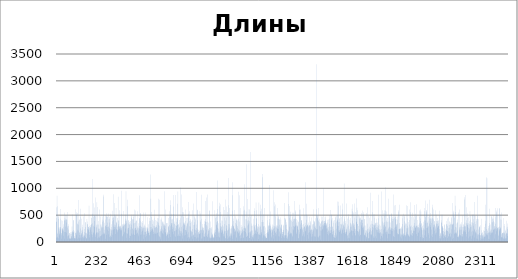
| Category | Series 0 |
|---|---|
| 0 | 445 |
| 1 | 380 |
| 2 | 83 |
| 3 | 373 |
| 4 | 645 |
| 5 | 859 |
| 6 | 99 |
| 7 | 174 |
| 8 | 79 |
| 9 | 666 |
| 10 | 151 |
| 11 | 461 |
| 12 | 430 |
| 13 | 271 |
| 14 | 71 |
| 15 | 486 |
| 16 | 248 |
| 17 | 273 |
| 18 | 211 |
| 19 | 127 |
| 20 | 151 |
| 21 | 172 |
| 22 | 236 |
| 23 | 614 |
| 24 | 433 |
| 25 | 279 |
| 26 | 270 |
| 27 | 407 |
| 28 | 169 |
| 29 | 60 |
| 30 | 159 |
| 31 | 126 |
| 32 | 249 |
| 33 | 216 |
| 34 | 262 |
| 35 | 247 |
| 36 | 397 |
| 37 | 233 |
| 38 | 235 |
| 39 | 286 |
| 40 | 199 |
| 41 | 117 |
| 42 | 330 |
| 43 | 396 |
| 44 | 186 |
| 45 | 61 |
| 46 | 547 |
| 47 | 409 |
| 48 | 453 |
| 49 | 407 |
| 50 | 432 |
| 51 | 288 |
| 52 | 504 |
| 53 | 186 |
| 54 | 424 |
| 55 | 414 |
| 56 | 174 |
| 57 | 364 |
| 58 | 502 |
| 59 | 415 |
| 60 | 263 |
| 61 | 295 |
| 62 | 557 |
| 63 | 62 |
| 64 | 106 |
| 65 | 300 |
| 66 | 329 |
| 67 | 125 |
| 68 | 233 |
| 69 | 117 |
| 70 | 139 |
| 71 | 72 |
| 72 | 169 |
| 73 | 62 |
| 74 | 169 |
| 75 | 64 |
| 76 | 65 |
| 77 | 147 |
| 78 | 67 |
| 79 | 59 |
| 80 | 183 |
| 81 | 110 |
| 82 | 183 |
| 83 | 100 |
| 84 | 70 |
| 85 | 150 |
| 86 | 288 |
| 87 | 514 |
| 88 | 208 |
| 89 | 175 |
| 90 | 193 |
| 91 | 72 |
| 92 | 179 |
| 93 | 411 |
| 94 | 224 |
| 95 | 401 |
| 96 | 183 |
| 97 | 200 |
| 98 | 74 |
| 99 | 67 |
| 100 | 81 |
| 101 | 66 |
| 102 | 114 |
| 103 | 65 |
| 104 | 71 |
| 105 | 166 |
| 106 | 172 |
| 107 | 611 |
| 108 | 505 |
| 109 | 504 |
| 110 | 554 |
| 111 | 158 |
| 112 | 124 |
| 113 | 195 |
| 114 | 329 |
| 115 | 345 |
| 116 | 230 |
| 117 | 60 |
| 118 | 539 |
| 119 | 782 |
| 120 | 85 |
| 121 | 324 |
| 122 | 215 |
| 123 | 382 |
| 124 | 421 |
| 125 | 185 |
| 126 | 416 |
| 127 | 131 |
| 128 | 167 |
| 129 | 70 |
| 130 | 124 |
| 131 | 251 |
| 132 | 621 |
| 133 | 469 |
| 134 | 85 |
| 135 | 167 |
| 136 | 435 |
| 137 | 135 |
| 138 | 212 |
| 139 | 154 |
| 140 | 71 |
| 141 | 91 |
| 142 | 193 |
| 143 | 229 |
| 144 | 279 |
| 145 | 319 |
| 146 | 140 |
| 147 | 96 |
| 148 | 477 |
| 149 | 108 |
| 150 | 70 |
| 151 | 77 |
| 152 | 535 |
| 153 | 186 |
| 154 | 119 |
| 155 | 240 |
| 156 | 119 |
| 157 | 92 |
| 158 | 371 |
| 159 | 277 |
| 160 | 361 |
| 161 | 168 |
| 162 | 66 |
| 163 | 170 |
| 164 | 64 |
| 165 | 159 |
| 166 | 74 |
| 167 | 430 |
| 168 | 383 |
| 169 | 332 |
| 170 | 143 |
| 171 | 332 |
| 172 | 240 |
| 173 | 274 |
| 174 | 236 |
| 175 | 219 |
| 176 | 284 |
| 177 | 279 |
| 178 | 674 |
| 179 | 255 |
| 180 | 188 |
| 181 | 297 |
| 182 | 85 |
| 183 | 131 |
| 184 | 283 |
| 185 | 317 |
| 186 | 235 |
| 187 | 276 |
| 188 | 272 |
| 189 | 455 |
| 190 | 329 |
| 191 | 143 |
| 192 | 447 |
| 193 | 324 |
| 194 | 191 |
| 195 | 1173 |
| 196 | 528 |
| 197 | 350 |
| 198 | 89 |
| 199 | 137 |
| 200 | 163 |
| 201 | 467 |
| 202 | 180 |
| 203 | 721 |
| 204 | 293 |
| 205 | 309 |
| 206 | 499 |
| 207 | 393 |
| 208 | 278 |
| 209 | 640 |
| 210 | 486 |
| 211 | 475 |
| 212 | 93 |
| 213 | 153 |
| 214 | 830 |
| 215 | 127 |
| 216 | 287 |
| 217 | 174 |
| 218 | 270 |
| 219 | 322 |
| 220 | 178 |
| 221 | 738 |
| 222 | 186 |
| 223 | 69 |
| 224 | 162 |
| 225 | 328 |
| 226 | 652 |
| 227 | 172 |
| 228 | 390 |
| 229 | 90 |
| 230 | 252 |
| 231 | 324 |
| 232 | 245 |
| 233 | 249 |
| 234 | 605 |
| 235 | 103 |
| 236 | 198 |
| 237 | 79 |
| 238 | 476 |
| 239 | 211 |
| 240 | 109 |
| 241 | 328 |
| 242 | 114 |
| 243 | 328 |
| 244 | 258 |
| 245 | 118 |
| 246 | 292 |
| 247 | 135 |
| 248 | 281 |
| 249 | 376 |
| 250 | 473 |
| 251 | 145 |
| 252 | 414 |
| 253 | 270 |
| 254 | 880 |
| 255 | 172 |
| 256 | 142 |
| 257 | 849 |
| 258 | 399 |
| 259 | 274 |
| 260 | 226 |
| 261 | 357 |
| 262 | 171 |
| 263 | 155 |
| 264 | 146 |
| 265 | 59 |
| 266 | 300 |
| 267 | 498 |
| 268 | 418 |
| 269 | 306 |
| 270 | 280 |
| 271 | 134 |
| 272 | 467 |
| 273 | 318 |
| 274 | 482 |
| 275 | 535 |
| 276 | 234 |
| 277 | 474 |
| 278 | 361 |
| 279 | 279 |
| 280 | 464 |
| 281 | 289 |
| 282 | 143 |
| 283 | 205 |
| 284 | 532 |
| 285 | 285 |
| 286 | 422 |
| 287 | 431 |
| 288 | 91 |
| 289 | 255 |
| 290 | 363 |
| 291 | 464 |
| 292 | 236 |
| 293 | 528 |
| 294 | 116 |
| 295 | 82 |
| 296 | 116 |
| 297 | 163 |
| 298 | 213 |
| 299 | 234 |
| 300 | 331 |
| 301 | 92 |
| 302 | 279 |
| 303 | 388 |
| 304 | 452 |
| 305 | 580 |
| 306 | 137 |
| 307 | 229 |
| 308 | 890 |
| 309 | 452 |
| 310 | 463 |
| 311 | 408 |
| 312 | 229 |
| 313 | 287 |
| 314 | 244 |
| 315 | 326 |
| 316 | 505 |
| 317 | 278 |
| 318 | 725 |
| 319 | 151 |
| 320 | 473 |
| 321 | 492 |
| 322 | 275 |
| 323 | 314 |
| 324 | 632 |
| 325 | 376 |
| 326 | 235 |
| 327 | 238 |
| 328 | 362 |
| 329 | 349 |
| 330 | 212 |
| 331 | 283 |
| 332 | 449 |
| 333 | 228 |
| 334 | 180 |
| 335 | 842 |
| 336 | 331 |
| 337 | 228 |
| 338 | 295 |
| 339 | 403 |
| 340 | 394 |
| 341 | 241 |
| 342 | 591 |
| 343 | 300 |
| 344 | 286 |
| 345 | 271 |
| 346 | 250 |
| 347 | 221 |
| 348 | 287 |
| 349 | 306 |
| 350 | 294 |
| 351 | 268 |
| 352 | 254 |
| 353 | 226 |
| 354 | 214 |
| 355 | 954 |
| 356 | 528 |
| 357 | 101 |
| 358 | 116 |
| 359 | 311 |
| 360 | 282 |
| 361 | 334 |
| 362 | 293 |
| 363 | 143 |
| 364 | 321 |
| 365 | 575 |
| 366 | 295 |
| 367 | 338 |
| 368 | 318 |
| 369 | 326 |
| 370 | 197 |
| 371 | 175 |
| 372 | 345 |
| 373 | 334 |
| 374 | 395 |
| 375 | 251 |
| 376 | 509 |
| 377 | 432 |
| 378 | 946 |
| 379 | 165 |
| 380 | 359 |
| 381 | 393 |
| 382 | 415 |
| 383 | 78 |
| 384 | 250 |
| 385 | 787 |
| 386 | 152 |
| 387 | 157 |
| 388 | 664 |
| 389 | 224 |
| 390 | 260 |
| 391 | 344 |
| 392 | 411 |
| 393 | 267 |
| 394 | 396 |
| 395 | 319 |
| 396 | 123 |
| 397 | 371 |
| 398 | 76 |
| 399 | 331 |
| 400 | 391 |
| 401 | 118 |
| 402 | 112 |
| 403 | 346 |
| 404 | 234 |
| 405 | 280 |
| 406 | 323 |
| 407 | 474 |
| 408 | 445 |
| 409 | 160 |
| 410 | 506 |
| 411 | 137 |
| 412 | 242 |
| 413 | 257 |
| 414 | 428 |
| 415 | 412 |
| 416 | 154 |
| 417 | 464 |
| 418 | 505 |
| 419 | 217 |
| 420 | 423 |
| 421 | 346 |
| 422 | 355 |
| 423 | 252 |
| 424 | 132 |
| 425 | 137 |
| 426 | 604 |
| 427 | 585 |
| 428 | 266 |
| 429 | 262 |
| 430 | 362 |
| 431 | 217 |
| 432 | 397 |
| 433 | 153 |
| 434 | 221 |
| 435 | 393 |
| 436 | 403 |
| 437 | 235 |
| 438 | 573 |
| 439 | 295 |
| 440 | 161 |
| 441 | 177 |
| 442 | 254 |
| 443 | 274 |
| 444 | 214 |
| 445 | 255 |
| 446 | 141 |
| 447 | 108 |
| 448 | 351 |
| 449 | 296 |
| 450 | 253 |
| 451 | 442 |
| 452 | 441 |
| 453 | 871 |
| 454 | 539 |
| 455 | 134 |
| 456 | 394 |
| 457 | 304 |
| 458 | 532 |
| 459 | 237 |
| 460 | 140 |
| 461 | 191 |
| 462 | 368 |
| 463 | 289 |
| 464 | 279 |
| 465 | 392 |
| 466 | 207 |
| 467 | 234 |
| 468 | 270 |
| 469 | 352 |
| 470 | 257 |
| 471 | 263 |
| 472 | 290 |
| 473 | 133 |
| 474 | 548 |
| 475 | 60 |
| 476 | 328 |
| 477 | 266 |
| 478 | 303 |
| 479 | 134 |
| 480 | 192 |
| 481 | 548 |
| 482 | 258 |
| 483 | 288 |
| 484 | 189 |
| 485 | 89 |
| 486 | 188 |
| 487 | 269 |
| 488 | 146 |
| 489 | 152 |
| 490 | 110 |
| 491 | 207 |
| 492 | 215 |
| 493 | 266 |
| 494 | 242 |
| 495 | 463 |
| 496 | 274 |
| 497 | 254 |
| 498 | 199 |
| 499 | 168 |
| 500 | 330 |
| 501 | 167 |
| 502 | 196 |
| 503 | 393 |
| 504 | 126 |
| 505 | 127 |
| 506 | 448 |
| 507 | 176 |
| 508 | 278 |
| 509 | 396 |
| 510 | 187 |
| 511 | 219 |
| 512 | 1255 |
| 513 | 805 |
| 514 | 558 |
| 515 | 239 |
| 516 | 203 |
| 517 | 278 |
| 518 | 466 |
| 519 | 234 |
| 520 | 411 |
| 521 | 261 |
| 522 | 335 |
| 523 | 237 |
| 524 | 420 |
| 525 | 188 |
| 526 | 149 |
| 527 | 304 |
| 528 | 385 |
| 529 | 214 |
| 530 | 266 |
| 531 | 599 |
| 532 | 450 |
| 533 | 159 |
| 534 | 300 |
| 535 | 170 |
| 536 | 409 |
| 537 | 271 |
| 538 | 150 |
| 539 | 264 |
| 540 | 285 |
| 541 | 160 |
| 542 | 287 |
| 543 | 394 |
| 544 | 316 |
| 545 | 278 |
| 546 | 447 |
| 547 | 255 |
| 548 | 171 |
| 549 | 381 |
| 550 | 174 |
| 551 | 374 |
| 552 | 119 |
| 553 | 348 |
| 554 | 805 |
| 555 | 443 |
| 556 | 312 |
| 557 | 102 |
| 558 | 182 |
| 559 | 788 |
| 560 | 103 |
| 561 | 302 |
| 562 | 88 |
| 563 | 240 |
| 564 | 215 |
| 565 | 419 |
| 566 | 53 |
| 567 | 194 |
| 568 | 299 |
| 569 | 421 |
| 570 | 200 |
| 571 | 272 |
| 572 | 454 |
| 573 | 173 |
| 574 | 159 |
| 575 | 233 |
| 576 | 379 |
| 577 | 363 |
| 578 | 386 |
| 579 | 305 |
| 580 | 144 |
| 581 | 212 |
| 582 | 364 |
| 583 | 336 |
| 584 | 946 |
| 585 | 326 |
| 586 | 299 |
| 587 | 267 |
| 588 | 321 |
| 589 | 182 |
| 590 | 483 |
| 591 | 302 |
| 592 | 603 |
| 593 | 176 |
| 594 | 241 |
| 595 | 355 |
| 596 | 350 |
| 597 | 107 |
| 598 | 145 |
| 599 | 116 |
| 600 | 168 |
| 601 | 130 |
| 602 | 353 |
| 603 | 185 |
| 604 | 141 |
| 605 | 147 |
| 606 | 288 |
| 607 | 446 |
| 608 | 80 |
| 609 | 299 |
| 610 | 275 |
| 611 | 149 |
| 612 | 572 |
| 613 | 216 |
| 614 | 318 |
| 615 | 477 |
| 616 | 230 |
| 617 | 465 |
| 618 | 291 |
| 619 | 91 |
| 620 | 691 |
| 621 | 779 |
| 622 | 350 |
| 623 | 525 |
| 624 | 355 |
| 625 | 319 |
| 626 | 420 |
| 627 | 433 |
| 628 | 241 |
| 629 | 284 |
| 630 | 193 |
| 631 | 420 |
| 632 | 347 |
| 633 | 519 |
| 634 | 268 |
| 635 | 874 |
| 636 | 660 |
| 637 | 145 |
| 638 | 204 |
| 639 | 337 |
| 640 | 343 |
| 641 | 198 |
| 642 | 381 |
| 643 | 114 |
| 644 | 95 |
| 645 | 876 |
| 646 | 215 |
| 647 | 310 |
| 648 | 256 |
| 649 | 303 |
| 650 | 304 |
| 651 | 377 |
| 652 | 229 |
| 653 | 443 |
| 654 | 317 |
| 655 | 445 |
| 656 | 714 |
| 657 | 114 |
| 658 | 414 |
| 659 | 940 |
| 660 | 322 |
| 661 | 333 |
| 662 | 117 |
| 663 | 143 |
| 664 | 245 |
| 665 | 408 |
| 666 | 286 |
| 667 | 264 |
| 668 | 216 |
| 669 | 112 |
| 670 | 359 |
| 671 | 105 |
| 672 | 171 |
| 673 | 203 |
| 674 | 1015 |
| 675 | 443 |
| 676 | 886 |
| 677 | 278 |
| 678 | 199 |
| 679 | 155 |
| 680 | 482 |
| 681 | 309 |
| 682 | 645 |
| 683 | 173 |
| 684 | 65 |
| 685 | 120 |
| 686 | 559 |
| 687 | 552 |
| 688 | 361 |
| 689 | 467 |
| 690 | 248 |
| 691 | 339 |
| 692 | 334 |
| 693 | 123 |
| 694 | 315 |
| 695 | 349 |
| 696 | 365 |
| 697 | 313 |
| 698 | 132 |
| 699 | 223 |
| 700 | 391 |
| 701 | 604 |
| 702 | 229 |
| 703 | 190 |
| 704 | 219 |
| 705 | 270 |
| 706 | 303 |
| 707 | 449 |
| 708 | 340 |
| 709 | 78 |
| 710 | 145 |
| 711 | 344 |
| 712 | 364 |
| 713 | 451 |
| 714 | 183 |
| 715 | 527 |
| 716 | 93 |
| 717 | 457 |
| 718 | 747 |
| 719 | 61 |
| 720 | 88 |
| 721 | 573 |
| 722 | 293 |
| 723 | 393 |
| 724 | 77 |
| 725 | 429 |
| 726 | 352 |
| 727 | 288 |
| 728 | 213 |
| 729 | 399 |
| 730 | 181 |
| 731 | 377 |
| 732 | 104 |
| 733 | 214 |
| 734 | 198 |
| 735 | 118 |
| 736 | 244 |
| 737 | 589 |
| 738 | 406 |
| 739 | 187 |
| 740 | 59 |
| 741 | 124 |
| 742 | 143 |
| 743 | 318 |
| 744 | 127 |
| 745 | 719 |
| 746 | 492 |
| 747 | 321 |
| 748 | 461 |
| 749 | 367 |
| 750 | 91 |
| 751 | 237 |
| 752 | 443 |
| 753 | 419 |
| 754 | 224 |
| 755 | 161 |
| 756 | 91 |
| 757 | 260 |
| 758 | 212 |
| 759 | 929 |
| 760 | 326 |
| 761 | 66 |
| 762 | 140 |
| 763 | 592 |
| 764 | 600 |
| 765 | 83 |
| 766 | 406 |
| 767 | 234 |
| 768 | 183 |
| 769 | 83 |
| 770 | 230 |
| 771 | 157 |
| 772 | 188 |
| 773 | 146 |
| 774 | 214 |
| 775 | 154 |
| 776 | 201 |
| 777 | 155 |
| 778 | 573 |
| 779 | 379 |
| 780 | 405 |
| 781 | 532 |
| 782 | 222 |
| 783 | 163 |
| 784 | 881 |
| 785 | 435 |
| 786 | 219 |
| 787 | 230 |
| 788 | 66 |
| 789 | 66 |
| 790 | 337 |
| 791 | 283 |
| 792 | 173 |
| 793 | 233 |
| 794 | 264 |
| 795 | 265 |
| 796 | 267 |
| 797 | 211 |
| 798 | 225 |
| 799 | 102 |
| 800 | 111 |
| 801 | 94 |
| 802 | 335 |
| 803 | 396 |
| 804 | 152 |
| 805 | 93 |
| 806 | 428 |
| 807 | 379 |
| 808 | 176 |
| 809 | 763 |
| 810 | 382 |
| 811 | 113 |
| 812 | 374 |
| 813 | 226 |
| 814 | 827 |
| 815 | 316 |
| 816 | 291 |
| 817 | 882 |
| 818 | 88 |
| 819 | 140 |
| 820 | 100 |
| 821 | 383 |
| 822 | 213 |
| 823 | 157 |
| 824 | 244 |
| 825 | 360 |
| 826 | 210 |
| 827 | 219 |
| 828 | 97 |
| 829 | 71 |
| 830 | 576 |
| 831 | 591 |
| 832 | 259 |
| 833 | 382 |
| 834 | 256 |
| 835 | 72 |
| 836 | 89 |
| 837 | 72 |
| 838 | 101 |
| 839 | 252 |
| 840 | 280 |
| 841 | 74 |
| 842 | 176 |
| 843 | 133 |
| 844 | 154 |
| 845 | 119 |
| 846 | 140 |
| 847 | 757 |
| 848 | 86 |
| 849 | 76 |
| 850 | 86 |
| 851 | 103 |
| 852 | 91 |
| 853 | 71 |
| 854 | 162 |
| 855 | 214 |
| 856 | 145 |
| 857 | 177 |
| 858 | 82 |
| 859 | 593 |
| 860 | 131 |
| 861 | 234 |
| 862 | 480 |
| 863 | 187 |
| 864 | 448 |
| 865 | 369 |
| 866 | 325 |
| 867 | 535 |
| 868 | 468 |
| 869 | 312 |
| 870 | 93 |
| 871 | 265 |
| 872 | 613 |
| 873 | 389 |
| 874 | 1143 |
| 875 | 383 |
| 876 | 103 |
| 877 | 190 |
| 878 | 163 |
| 879 | 347 |
| 880 | 248 |
| 881 | 200 |
| 882 | 170 |
| 883 | 730 |
| 884 | 84 |
| 885 | 664 |
| 886 | 89 |
| 887 | 702 |
| 888 | 250 |
| 889 | 349 |
| 890 | 292 |
| 891 | 559 |
| 892 | 295 |
| 893 | 281 |
| 894 | 398 |
| 895 | 221 |
| 896 | 166 |
| 897 | 187 |
| 898 | 483 |
| 899 | 394 |
| 900 | 211 |
| 901 | 314 |
| 902 | 231 |
| 903 | 145 |
| 904 | 289 |
| 905 | 108 |
| 906 | 653 |
| 907 | 158 |
| 908 | 193 |
| 909 | 334 |
| 910 | 103 |
| 911 | 594 |
| 912 | 458 |
| 913 | 208 |
| 914 | 71 |
| 915 | 204 |
| 916 | 71 |
| 917 | 401 |
| 918 | 791 |
| 919 | 164 |
| 920 | 317 |
| 921 | 458 |
| 922 | 253 |
| 923 | 663 |
| 924 | 300 |
| 925 | 216 |
| 926 | 215 |
| 927 | 62 |
| 928 | 120 |
| 929 | 557 |
| 930 | 682 |
| 931 | 336 |
| 932 | 86 |
| 933 | 231 |
| 934 | 1190 |
| 935 | 269 |
| 936 | 332 |
| 937 | 631 |
| 938 | 112 |
| 939 | 475 |
| 940 | 90 |
| 941 | 80 |
| 942 | 171 |
| 943 | 249 |
| 944 | 115 |
| 945 | 143 |
| 946 | 140 |
| 947 | 163 |
| 948 | 298 |
| 949 | 270 |
| 950 | 253 |
| 951 | 109 |
| 952 | 870 |
| 953 | 62 |
| 954 | 1112 |
| 955 | 320 |
| 956 | 585 |
| 957 | 302 |
| 958 | 296 |
| 959 | 389 |
| 960 | 273 |
| 961 | 438 |
| 962 | 135 |
| 963 | 257 |
| 964 | 190 |
| 965 | 245 |
| 966 | 241 |
| 967 | 598 |
| 968 | 193 |
| 969 | 356 |
| 970 | 481 |
| 971 | 205 |
| 972 | 225 |
| 973 | 406 |
| 974 | 437 |
| 975 | 91 |
| 976 | 73 |
| 977 | 325 |
| 978 | 421 |
| 979 | 191 |
| 980 | 296 |
| 981 | 263 |
| 982 | 401 |
| 983 | 200 |
| 984 | 158 |
| 985 | 937 |
| 986 | 172 |
| 987 | 432 |
| 988 | 238 |
| 989 | 212 |
| 990 | 869 |
| 991 | 213 |
| 992 | 180 |
| 993 | 110 |
| 994 | 381 |
| 995 | 135 |
| 996 | 120 |
| 997 | 68 |
| 998 | 213 |
| 999 | 633 |
| 1000 | 315 |
| 1001 | 163 |
| 1002 | 278 |
| 1003 | 202 |
| 1004 | 157 |
| 1005 | 73 |
| 1006 | 236 |
| 1007 | 497 |
| 1008 | 182 |
| 1009 | 219 |
| 1010 | 287 |
| 1011 | 257 |
| 1012 | 207 |
| 1013 | 79 |
| 1014 | 664 |
| 1015 | 78 |
| 1016 | 583 |
| 1017 | 602 |
| 1018 | 206 |
| 1019 | 1075 |
| 1020 | 262 |
| 1021 | 293 |
| 1022 | 240 |
| 1023 | 185 |
| 1024 | 270 |
| 1025 | 261 |
| 1026 | 424 |
| 1027 | 568 |
| 1028 | 1446 |
| 1029 | 157 |
| 1030 | 425 |
| 1031 | 94 |
| 1032 | 100 |
| 1033 | 799 |
| 1034 | 115 |
| 1035 | 394 |
| 1036 | 112 |
| 1037 | 306 |
| 1038 | 325 |
| 1039 | 404 |
| 1040 | 459 |
| 1041 | 348 |
| 1042 | 173 |
| 1043 | 612 |
| 1044 | 385 |
| 1045 | 607 |
| 1046 | 76 |
| 1047 | 76 |
| 1048 | 182 |
| 1049 | 472 |
| 1050 | 194 |
| 1051 | 194 |
| 1052 | 1675 |
| 1053 | 160 |
| 1054 | 109 |
| 1055 | 499 |
| 1056 | 215 |
| 1057 | 344 |
| 1058 | 301 |
| 1059 | 49 |
| 1060 | 301 |
| 1061 | 89 |
| 1062 | 99 |
| 1063 | 215 |
| 1064 | 126 |
| 1065 | 64 |
| 1066 | 159 |
| 1067 | 103 |
| 1068 | 129 |
| 1069 | 432 |
| 1070 | 326 |
| 1071 | 283 |
| 1072 | 148 |
| 1073 | 578 |
| 1074 | 628 |
| 1075 | 309 |
| 1076 | 212 |
| 1077 | 164 |
| 1078 | 317 |
| 1079 | 253 |
| 1080 | 216 |
| 1081 | 736 |
| 1082 | 148 |
| 1083 | 438 |
| 1084 | 441 |
| 1085 | 589 |
| 1086 | 345 |
| 1087 | 181 |
| 1088 | 300 |
| 1089 | 192 |
| 1090 | 276 |
| 1091 | 246 |
| 1092 | 277 |
| 1093 | 137 |
| 1094 | 57 |
| 1095 | 148 |
| 1096 | 336 |
| 1097 | 734 |
| 1098 | 158 |
| 1099 | 131 |
| 1100 | 136 |
| 1101 | 302 |
| 1102 | 269 |
| 1103 | 303 |
| 1104 | 694 |
| 1105 | 124 |
| 1106 | 571 |
| 1107 | 278 |
| 1108 | 172 |
| 1109 | 188 |
| 1110 | 620 |
| 1111 | 373 |
| 1112 | 152 |
| 1113 | 234 |
| 1114 | 374 |
| 1115 | 411 |
| 1116 | 86 |
| 1117 | 1206 |
| 1118 | 1267 |
| 1119 | 134 |
| 1120 | 297 |
| 1121 | 372 |
| 1122 | 514 |
| 1123 | 286 |
| 1124 | 118 |
| 1125 | 106 |
| 1126 | 635 |
| 1127 | 137 |
| 1128 | 300 |
| 1129 | 198 |
| 1130 | 270 |
| 1131 | 99 |
| 1132 | 70 |
| 1133 | 150 |
| 1134 | 108 |
| 1135 | 90 |
| 1136 | 75 |
| 1137 | 76 |
| 1138 | 166 |
| 1139 | 80 |
| 1140 | 72 |
| 1141 | 506 |
| 1142 | 164 |
| 1143 | 184 |
| 1144 | 227 |
| 1145 | 403 |
| 1146 | 288 |
| 1147 | 215 |
| 1148 | 153 |
| 1149 | 301 |
| 1150 | 184 |
| 1151 | 314 |
| 1152 | 430 |
| 1153 | 362 |
| 1154 | 1059 |
| 1155 | 309 |
| 1156 | 241 |
| 1157 | 210 |
| 1158 | 569 |
| 1159 | 232 |
| 1160 | 325 |
| 1161 | 296 |
| 1162 | 272 |
| 1163 | 81 |
| 1164 | 104 |
| 1165 | 172 |
| 1166 | 245 |
| 1167 | 228 |
| 1168 | 285 |
| 1169 | 197 |
| 1170 | 325 |
| 1171 | 221 |
| 1172 | 228 |
| 1173 | 248 |
| 1174 | 964 |
| 1175 | 65 |
| 1176 | 132 |
| 1177 | 309 |
| 1178 | 253 |
| 1179 | 742 |
| 1180 | 666 |
| 1181 | 204 |
| 1182 | 297 |
| 1183 | 269 |
| 1184 | 473 |
| 1185 | 179 |
| 1186 | 289 |
| 1187 | 170 |
| 1188 | 699 |
| 1189 | 107 |
| 1190 | 288 |
| 1191 | 195 |
| 1192 | 143 |
| 1193 | 263 |
| 1194 | 312 |
| 1195 | 438 |
| 1196 | 249 |
| 1197 | 250 |
| 1198 | 305 |
| 1199 | 633 |
| 1200 | 290 |
| 1201 | 241 |
| 1202 | 491 |
| 1203 | 105 |
| 1204 | 431 |
| 1205 | 470 |
| 1206 | 195 |
| 1207 | 415 |
| 1208 | 426 |
| 1209 | 319 |
| 1210 | 102 |
| 1211 | 256 |
| 1212 | 282 |
| 1213 | 455 |
| 1214 | 143 |
| 1215 | 162 |
| 1216 | 413 |
| 1217 | 245 |
| 1218 | 314 |
| 1219 | 319 |
| 1220 | 76 |
| 1221 | 324 |
| 1222 | 149 |
| 1223 | 114 |
| 1224 | 145 |
| 1225 | 188 |
| 1226 | 185 |
| 1227 | 225 |
| 1228 | 185 |
| 1229 | 228 |
| 1230 | 84 |
| 1231 | 302 |
| 1232 | 320 |
| 1233 | 727 |
| 1234 | 121 |
| 1235 | 77 |
| 1236 | 125 |
| 1237 | 446 |
| 1238 | 130 |
| 1239 | 444 |
| 1240 | 121 |
| 1241 | 418 |
| 1242 | 420 |
| 1243 | 317 |
| 1244 | 243 |
| 1245 | 76 |
| 1246 | 126 |
| 1247 | 369 |
| 1248 | 324 |
| 1249 | 68 |
| 1250 | 229 |
| 1251 | 96 |
| 1252 | 49 |
| 1253 | 170 |
| 1254 | 116 |
| 1255 | 706 |
| 1256 | 924 |
| 1257 | 212 |
| 1258 | 176 |
| 1259 | 202 |
| 1260 | 145 |
| 1261 | 451 |
| 1262 | 670 |
| 1263 | 495 |
| 1264 | 286 |
| 1265 | 509 |
| 1266 | 151 |
| 1267 | 564 |
| 1268 | 177 |
| 1269 | 416 |
| 1270 | 169 |
| 1271 | 389 |
| 1272 | 282 |
| 1273 | 144 |
| 1274 | 169 |
| 1275 | 419 |
| 1276 | 373 |
| 1277 | 116 |
| 1278 | 98 |
| 1279 | 471 |
| 1280 | 546 |
| 1281 | 239 |
| 1282 | 430 |
| 1283 | 299 |
| 1284 | 395 |
| 1285 | 546 |
| 1286 | 219 |
| 1287 | 763 |
| 1288 | 286 |
| 1289 | 283 |
| 1290 | 436 |
| 1291 | 427 |
| 1292 | 425 |
| 1293 | 593 |
| 1294 | 561 |
| 1295 | 458 |
| 1296 | 299 |
| 1297 | 323 |
| 1298 | 150 |
| 1299 | 430 |
| 1300 | 365 |
| 1301 | 307 |
| 1302 | 178 |
| 1303 | 404 |
| 1304 | 284 |
| 1305 | 305 |
| 1306 | 289 |
| 1307 | 304 |
| 1308 | 243 |
| 1309 | 67 |
| 1310 | 76 |
| 1311 | 367 |
| 1312 | 222 |
| 1313 | 382 |
| 1314 | 146 |
| 1315 | 695 |
| 1316 | 483 |
| 1317 | 602 |
| 1318 | 181 |
| 1319 | 463 |
| 1320 | 326 |
| 1321 | 606 |
| 1322 | 241 |
| 1323 | 245 |
| 1324 | 486 |
| 1325 | 353 |
| 1326 | 276 |
| 1327 | 405 |
| 1328 | 405 |
| 1329 | 402 |
| 1330 | 240 |
| 1331 | 268 |
| 1332 | 322 |
| 1333 | 107 |
| 1334 | 219 |
| 1335 | 121 |
| 1336 | 334 |
| 1337 | 184 |
| 1338 | 155 |
| 1339 | 626 |
| 1340 | 266 |
| 1341 | 278 |
| 1342 | 103 |
| 1343 | 285 |
| 1344 | 498 |
| 1345 | 296 |
| 1346 | 358 |
| 1347 | 197 |
| 1348 | 210 |
| 1349 | 252 |
| 1350 | 317 |
| 1351 | 1113 |
| 1352 | 714 |
| 1353 | 276 |
| 1354 | 298 |
| 1355 | 416 |
| 1356 | 511 |
| 1357 | 311 |
| 1358 | 323 |
| 1359 | 493 |
| 1360 | 132 |
| 1361 | 304 |
| 1362 | 327 |
| 1363 | 173 |
| 1364 | 294 |
| 1365 | 65 |
| 1366 | 274 |
| 1367 | 365 |
| 1368 | 310 |
| 1369 | 181 |
| 1370 | 471 |
| 1371 | 307 |
| 1372 | 309 |
| 1373 | 222 |
| 1374 | 368 |
| 1375 | 390 |
| 1376 | 155 |
| 1377 | 215 |
| 1378 | 307 |
| 1379 | 234 |
| 1380 | 96 |
| 1381 | 223 |
| 1382 | 245 |
| 1383 | 458 |
| 1384 | 310 |
| 1385 | 150 |
| 1386 | 219 |
| 1387 | 337 |
| 1388 | 182 |
| 1389 | 102 |
| 1390 | 337 |
| 1391 | 216 |
| 1392 | 609 |
| 1393 | 399 |
| 1394 | 236 |
| 1395 | 283 |
| 1396 | 378 |
| 1397 | 106 |
| 1398 | 364 |
| 1399 | 392 |
| 1400 | 99 |
| 1401 | 440 |
| 1402 | 101 |
| 1403 | 304 |
| 1404 | 271 |
| 1405 | 255 |
| 1406 | 238 |
| 1407 | 612 |
| 1408 | 501 |
| 1409 | 231 |
| 1410 | 3309 |
| 1411 | 497 |
| 1412 | 489 |
| 1413 | 444 |
| 1414 | 239 |
| 1415 | 456 |
| 1416 | 99 |
| 1417 | 635 |
| 1418 | 80 |
| 1419 | 98 |
| 1420 | 403 |
| 1421 | 385 |
| 1422 | 115 |
| 1423 | 307 |
| 1424 | 368 |
| 1425 | 291 |
| 1426 | 433 |
| 1427 | 121 |
| 1428 | 348 |
| 1429 | 41 |
| 1430 | 278 |
| 1431 | 342 |
| 1432 | 216 |
| 1433 | 290 |
| 1434 | 473 |
| 1435 | 388 |
| 1436 | 376 |
| 1437 | 215 |
| 1438 | 389 |
| 1439 | 404 |
| 1440 | 312 |
| 1441 | 471 |
| 1442 | 234 |
| 1443 | 246 |
| 1444 | 294 |
| 1445 | 388 |
| 1446 | 314 |
| 1447 | 999 |
| 1448 | 337 |
| 1449 | 391 |
| 1450 | 312 |
| 1451 | 354 |
| 1452 | 390 |
| 1453 | 347 |
| 1454 | 460 |
| 1455 | 413 |
| 1456 | 383 |
| 1457 | 309 |
| 1458 | 476 |
| 1459 | 352 |
| 1460 | 344 |
| 1461 | 319 |
| 1462 | 346 |
| 1463 | 251 |
| 1464 | 302 |
| 1465 | 246 |
| 1466 | 362 |
| 1467 | 151 |
| 1468 | 185 |
| 1469 | 412 |
| 1470 | 270 |
| 1471 | 204 |
| 1472 | 418 |
| 1473 | 277 |
| 1474 | 229 |
| 1475 | 126 |
| 1476 | 156 |
| 1477 | 196 |
| 1478 | 436 |
| 1479 | 333 |
| 1480 | 497 |
| 1481 | 295 |
| 1482 | 281 |
| 1483 | 167 |
| 1484 | 594 |
| 1485 | 219 |
| 1486 | 166 |
| 1487 | 395 |
| 1488 | 513 |
| 1489 | 222 |
| 1490 | 496 |
| 1491 | 420 |
| 1492 | 447 |
| 1493 | 291 |
| 1494 | 142 |
| 1495 | 191 |
| 1496 | 140 |
| 1497 | 279 |
| 1498 | 93 |
| 1499 | 239 |
| 1500 | 359 |
| 1501 | 396 |
| 1502 | 203 |
| 1503 | 98 |
| 1504 | 79 |
| 1505 | 80 |
| 1506 | 131 |
| 1507 | 411 |
| 1508 | 219 |
| 1509 | 75 |
| 1510 | 170 |
| 1511 | 458 |
| 1512 | 351 |
| 1513 | 476 |
| 1514 | 484 |
| 1515 | 101 |
| 1516 | 246 |
| 1517 | 141 |
| 1518 | 380 |
| 1519 | 303 |
| 1520 | 395 |
| 1521 | 752 |
| 1522 | 431 |
| 1523 | 410 |
| 1524 | 503 |
| 1525 | 369 |
| 1526 | 673 |
| 1527 | 748 |
| 1528 | 216 |
| 1529 | 299 |
| 1530 | 432 |
| 1531 | 373 |
| 1532 | 185 |
| 1533 | 191 |
| 1534 | 224 |
| 1535 | 447 |
| 1536 | 681 |
| 1537 | 237 |
| 1538 | 212 |
| 1539 | 263 |
| 1540 | 337 |
| 1541 | 151 |
| 1542 | 172 |
| 1543 | 322 |
| 1544 | 330 |
| 1545 | 467 |
| 1546 | 346 |
| 1547 | 604 |
| 1548 | 715 |
| 1549 | 219 |
| 1550 | 234 |
| 1551 | 257 |
| 1552 | 321 |
| 1553 | 292 |
| 1554 | 381 |
| 1555 | 319 |
| 1556 | 167 |
| 1557 | 1090 |
| 1558 | 233 |
| 1559 | 459 |
| 1560 | 285 |
| 1561 | 423 |
| 1562 | 179 |
| 1563 | 188 |
| 1564 | 351 |
| 1565 | 147 |
| 1566 | 162 |
| 1567 | 393 |
| 1568 | 212 |
| 1569 | 717 |
| 1570 | 250 |
| 1571 | 188 |
| 1572 | 238 |
| 1573 | 286 |
| 1574 | 111 |
| 1575 | 130 |
| 1576 | 67 |
| 1577 | 330 |
| 1578 | 436 |
| 1579 | 77 |
| 1580 | 140 |
| 1581 | 468 |
| 1582 | 304 |
| 1583 | 515 |
| 1584 | 174 |
| 1585 | 171 |
| 1586 | 70 |
| 1587 | 247 |
| 1588 | 209 |
| 1589 | 413 |
| 1590 | 345 |
| 1591 | 282 |
| 1592 | 358 |
| 1593 | 193 |
| 1594 | 449 |
| 1595 | 225 |
| 1596 | 314 |
| 1597 | 340 |
| 1598 | 284 |
| 1599 | 207 |
| 1600 | 619 |
| 1601 | 573 |
| 1602 | 207 |
| 1603 | 401 |
| 1604 | 119 |
| 1605 | 701 |
| 1606 | 352 |
| 1607 | 301 |
| 1608 | 329 |
| 1609 | 206 |
| 1610 | 551 |
| 1611 | 240 |
| 1612 | 167 |
| 1613 | 718 |
| 1614 | 327 |
| 1615 | 274 |
| 1616 | 450 |
| 1617 | 129 |
| 1618 | 118 |
| 1619 | 557 |
| 1620 | 208 |
| 1621 | 244 |
| 1622 | 432 |
| 1623 | 811 |
| 1624 | 478 |
| 1625 | 370 |
| 1626 | 382 |
| 1627 | 636 |
| 1628 | 336 |
| 1629 | 201 |
| 1630 | 333 |
| 1631 | 205 |
| 1632 | 589 |
| 1633 | 299 |
| 1634 | 501 |
| 1635 | 183 |
| 1636 | 139 |
| 1637 | 194 |
| 1638 | 215 |
| 1639 | 109 |
| 1640 | 244 |
| 1641 | 454 |
| 1642 | 486 |
| 1643 | 432 |
| 1644 | 132 |
| 1645 | 370 |
| 1646 | 134 |
| 1647 | 440 |
| 1648 | 457 |
| 1649 | 411 |
| 1650 | 420 |
| 1651 | 404 |
| 1652 | 542 |
| 1653 | 314 |
| 1654 | 285 |
| 1655 | 421 |
| 1656 | 587 |
| 1657 | 354 |
| 1658 | 261 |
| 1659 | 408 |
| 1660 | 289 |
| 1661 | 268 |
| 1662 | 230 |
| 1663 | 512 |
| 1664 | 552 |
| 1665 | 306 |
| 1666 | 427 |
| 1667 | 425 |
| 1668 | 141 |
| 1669 | 126 |
| 1670 | 126 |
| 1671 | 178 |
| 1672 | 307 |
| 1673 | 217 |
| 1674 | 162 |
| 1675 | 121 |
| 1676 | 63 |
| 1677 | 103 |
| 1678 | 541 |
| 1679 | 94 |
| 1680 | 216 |
| 1681 | 213 |
| 1682 | 648 |
| 1683 | 339 |
| 1684 | 156 |
| 1685 | 192 |
| 1686 | 240 |
| 1687 | 65 |
| 1688 | 250 |
| 1689 | 166 |
| 1690 | 487 |
| 1691 | 75 |
| 1692 | 75 |
| 1693 | 450 |
| 1694 | 284 |
| 1695 | 192 |
| 1696 | 189 |
| 1697 | 235 |
| 1698 | 915 |
| 1699 | 138 |
| 1700 | 326 |
| 1701 | 261 |
| 1702 | 228 |
| 1703 | 150 |
| 1704 | 133 |
| 1705 | 202 |
| 1706 | 124 |
| 1707 | 396 |
| 1708 | 341 |
| 1709 | 333 |
| 1710 | 223 |
| 1711 | 761 |
| 1712 | 553 |
| 1713 | 278 |
| 1714 | 80 |
| 1715 | 106 |
| 1716 | 512 |
| 1717 | 265 |
| 1718 | 317 |
| 1719 | 334 |
| 1720 | 516 |
| 1721 | 307 |
| 1722 | 81 |
| 1723 | 452 |
| 1724 | 314 |
| 1725 | 325 |
| 1726 | 358 |
| 1727 | 356 |
| 1728 | 261 |
| 1729 | 107 |
| 1730 | 239 |
| 1731 | 69 |
| 1732 | 433 |
| 1733 | 223 |
| 1734 | 357 |
| 1735 | 277 |
| 1736 | 271 |
| 1737 | 364 |
| 1738 | 180 |
| 1739 | 312 |
| 1740 | 223 |
| 1741 | 443 |
| 1742 | 304 |
| 1743 | 253 |
| 1744 | 878 |
| 1745 | 177 |
| 1746 | 485 |
| 1747 | 243 |
| 1748 | 174 |
| 1749 | 159 |
| 1750 | 212 |
| 1751 | 326 |
| 1752 | 227 |
| 1753 | 302 |
| 1754 | 60 |
| 1755 | 172 |
| 1756 | 186 |
| 1757 | 484 |
| 1758 | 243 |
| 1759 | 940 |
| 1760 | 156 |
| 1761 | 114 |
| 1762 | 115 |
| 1763 | 590 |
| 1764 | 86 |
| 1765 | 382 |
| 1766 | 159 |
| 1767 | 452 |
| 1768 | 226 |
| 1769 | 288 |
| 1770 | 320 |
| 1771 | 358 |
| 1772 | 155 |
| 1773 | 542 |
| 1774 | 366 |
| 1775 | 483 |
| 1776 | 321 |
| 1777 | 250 |
| 1778 | 593 |
| 1779 | 586 |
| 1780 | 282 |
| 1781 | 288 |
| 1782 | 180 |
| 1783 | 1019 |
| 1784 | 376 |
| 1785 | 145 |
| 1786 | 187 |
| 1787 | 212 |
| 1788 | 568 |
| 1789 | 399 |
| 1790 | 227 |
| 1791 | 374 |
| 1792 | 193 |
| 1793 | 445 |
| 1794 | 69 |
| 1795 | 805 |
| 1796 | 148 |
| 1797 | 249 |
| 1798 | 270 |
| 1799 | 156 |
| 1800 | 380 |
| 1801 | 470 |
| 1802 | 501 |
| 1803 | 286 |
| 1804 | 503 |
| 1805 | 150 |
| 1806 | 226 |
| 1807 | 363 |
| 1808 | 231 |
| 1809 | 275 |
| 1810 | 147 |
| 1811 | 254 |
| 1812 | 516 |
| 1813 | 442 |
| 1814 | 534 |
| 1815 | 256 |
| 1816 | 212 |
| 1817 | 203 |
| 1818 | 428 |
| 1819 | 390 |
| 1820 | 253 |
| 1821 | 472 |
| 1822 | 109 |
| 1823 | 105 |
| 1824 | 884 |
| 1825 | 238 |
| 1826 | 426 |
| 1827 | 463 |
| 1828 | 264 |
| 1829 | 450 |
| 1830 | 93 |
| 1831 | 680 |
| 1832 | 219 |
| 1833 | 469 |
| 1834 | 467 |
| 1835 | 687 |
| 1836 | 282 |
| 1837 | 418 |
| 1838 | 427 |
| 1839 | 329 |
| 1840 | 331 |
| 1841 | 285 |
| 1842 | 234 |
| 1843 | 313 |
| 1844 | 476 |
| 1845 | 338 |
| 1846 | 412 |
| 1847 | 167 |
| 1848 | 143 |
| 1849 | 147 |
| 1850 | 135 |
| 1851 | 147 |
| 1852 | 564 |
| 1853 | 589 |
| 1854 | 238 |
| 1855 | 240 |
| 1856 | 252 |
| 1857 | 238 |
| 1858 | 693 |
| 1859 | 355 |
| 1860 | 250 |
| 1861 | 87 |
| 1862 | 256 |
| 1863 | 123 |
| 1864 | 155 |
| 1865 | 244 |
| 1866 | 269 |
| 1867 | 67 |
| 1868 | 289 |
| 1869 | 126 |
| 1870 | 142 |
| 1871 | 488 |
| 1872 | 137 |
| 1873 | 442 |
| 1874 | 252 |
| 1875 | 334 |
| 1876 | 524 |
| 1877 | 106 |
| 1878 | 145 |
| 1879 | 142 |
| 1880 | 122 |
| 1881 | 168 |
| 1882 | 496 |
| 1883 | 128 |
| 1884 | 386 |
| 1885 | 306 |
| 1886 | 472 |
| 1887 | 122 |
| 1888 | 100 |
| 1889 | 359 |
| 1890 | 331 |
| 1891 | 133 |
| 1892 | 120 |
| 1893 | 191 |
| 1894 | 684 |
| 1895 | 256 |
| 1896 | 340 |
| 1897 | 160 |
| 1898 | 149 |
| 1899 | 669 |
| 1900 | 303 |
| 1901 | 255 |
| 1902 | 437 |
| 1903 | 373 |
| 1904 | 139 |
| 1905 | 137 |
| 1906 | 115 |
| 1907 | 270 |
| 1908 | 114 |
| 1909 | 109 |
| 1910 | 327 |
| 1911 | 92 |
| 1912 | 603 |
| 1913 | 409 |
| 1914 | 556 |
| 1915 | 289 |
| 1916 | 742 |
| 1917 | 139 |
| 1918 | 287 |
| 1919 | 215 |
| 1920 | 134 |
| 1921 | 221 |
| 1922 | 471 |
| 1923 | 305 |
| 1924 | 121 |
| 1925 | 113 |
| 1926 | 168 |
| 1927 | 167 |
| 1928 | 545 |
| 1929 | 281 |
| 1930 | 144 |
| 1931 | 463 |
| 1932 | 252 |
| 1933 | 217 |
| 1934 | 205 |
| 1935 | 304 |
| 1936 | 420 |
| 1937 | 307 |
| 1938 | 204 |
| 1939 | 690 |
| 1940 | 352 |
| 1941 | 261 |
| 1942 | 273 |
| 1943 | 269 |
| 1944 | 525 |
| 1945 | 477 |
| 1946 | 295 |
| 1947 | 308 |
| 1948 | 147 |
| 1949 | 701 |
| 1950 | 488 |
| 1951 | 298 |
| 1952 | 282 |
| 1953 | 308 |
| 1954 | 265 |
| 1955 | 408 |
| 1956 | 112 |
| 1957 | 183 |
| 1958 | 321 |
| 1959 | 254 |
| 1960 | 169 |
| 1961 | 279 |
| 1962 | 281 |
| 1963 | 349 |
| 1964 | 470 |
| 1965 | 216 |
| 1966 | 254 |
| 1967 | 586 |
| 1968 | 319 |
| 1969 | 604 |
| 1970 | 391 |
| 1971 | 93 |
| 1972 | 439 |
| 1973 | 568 |
| 1974 | 348 |
| 1975 | 346 |
| 1976 | 259 |
| 1977 | 277 |
| 1978 | 235 |
| 1979 | 95 |
| 1980 | 217 |
| 1981 | 296 |
| 1982 | 140 |
| 1983 | 65 |
| 1984 | 322 |
| 1985 | 262 |
| 1986 | 376 |
| 1987 | 232 |
| 1988 | 73 |
| 1989 | 73 |
| 1990 | 634 |
| 1991 | 234 |
| 1992 | 573 |
| 1993 | 404 |
| 1994 | 127 |
| 1995 | 216 |
| 1996 | 477 |
| 1997 | 463 |
| 1998 | 398 |
| 1999 | 772 |
| 2000 | 347 |
| 2001 | 260 |
| 2002 | 596 |
| 2003 | 584 |
| 2004 | 554 |
| 2005 | 100 |
| 2006 | 712 |
| 2007 | 261 |
| 2008 | 360 |
| 2009 | 288 |
| 2010 | 357 |
| 2011 | 397 |
| 2012 | 302 |
| 2013 | 137 |
| 2014 | 167 |
| 2015 | 282 |
| 2016 | 470 |
| 2017 | 69 |
| 2018 | 785 |
| 2019 | 436 |
| 2020 | 344 |
| 2021 | 492 |
| 2022 | 539 |
| 2023 | 436 |
| 2024 | 280 |
| 2025 | 313 |
| 2026 | 437 |
| 2027 | 386 |
| 2028 | 455 |
| 2029 | 423 |
| 2030 | 355 |
| 2031 | 119 |
| 2032 | 234 |
| 2033 | 444 |
| 2034 | 149 |
| 2035 | 94 |
| 2036 | 641 |
| 2037 | 693 |
| 2038 | 442 |
| 2039 | 607 |
| 2040 | 284 |
| 2041 | 322 |
| 2042 | 418 |
| 2043 | 268 |
| 2044 | 208 |
| 2045 | 312 |
| 2046 | 329 |
| 2047 | 386 |
| 2048 | 393 |
| 2049 | 135 |
| 2050 | 269 |
| 2051 | 295 |
| 2052 | 161 |
| 2053 | 589 |
| 2054 | 237 |
| 2055 | 177 |
| 2056 | 392 |
| 2057 | 332 |
| 2058 | 506 |
| 2059 | 349 |
| 2060 | 333 |
| 2061 | 445 |
| 2062 | 261 |
| 2063 | 284 |
| 2064 | 385 |
| 2065 | 392 |
| 2066 | 296 |
| 2067 | 405 |
| 2068 | 288 |
| 2069 | 308 |
| 2070 | 348 |
| 2071 | 111 |
| 2072 | 493 |
| 2073 | 241 |
| 2074 | 582 |
| 2075 | 70 |
| 2076 | 158 |
| 2077 | 123 |
| 2078 | 171 |
| 2079 | 159 |
| 2080 | 59 |
| 2081 | 77 |
| 2082 | 363 |
| 2083 | 105 |
| 2084 | 405 |
| 2085 | 509 |
| 2086 | 360 |
| 2087 | 262 |
| 2088 | 509 |
| 2089 | 296 |
| 2090 | 279 |
| 2091 | 294 |
| 2092 | 204 |
| 2093 | 138 |
| 2094 | 152 |
| 2095 | 206 |
| 2096 | 76 |
| 2097 | 258 |
| 2098 | 105 |
| 2099 | 119 |
| 2100 | 186 |
| 2101 | 311 |
| 2102 | 330 |
| 2103 | 202 |
| 2104 | 94 |
| 2105 | 136 |
| 2106 | 85 |
| 2107 | 124 |
| 2108 | 249 |
| 2109 | 392 |
| 2110 | 220 |
| 2111 | 213 |
| 2112 | 337 |
| 2113 | 324 |
| 2114 | 74 |
| 2115 | 439 |
| 2116 | 205 |
| 2117 | 297 |
| 2118 | 205 |
| 2119 | 324 |
| 2120 | 99 |
| 2121 | 261 |
| 2122 | 461 |
| 2123 | 114 |
| 2124 | 191 |
| 2125 | 316 |
| 2126 | 148 |
| 2127 | 162 |
| 2128 | 387 |
| 2129 | 267 |
| 2130 | 369 |
| 2131 | 174 |
| 2132 | 324 |
| 2133 | 338 |
| 2134 | 89 |
| 2135 | 107 |
| 2136 | 440 |
| 2137 | 237 |
| 2138 | 472 |
| 2139 | 329 |
| 2140 | 154 |
| 2141 | 725 |
| 2142 | 328 |
| 2143 | 318 |
| 2144 | 329 |
| 2145 | 59 |
| 2146 | 339 |
| 2147 | 499 |
| 2148 | 341 |
| 2149 | 73 |
| 2150 | 584 |
| 2151 | 547 |
| 2152 | 171 |
| 2153 | 150 |
| 2154 | 448 |
| 2155 | 474 |
| 2156 | 228 |
| 2157 | 862 |
| 2158 | 175 |
| 2159 | 676 |
| 2160 | 558 |
| 2161 | 163 |
| 2162 | 278 |
| 2163 | 149 |
| 2164 | 173 |
| 2165 | 271 |
| 2166 | 178 |
| 2167 | 346 |
| 2168 | 361 |
| 2169 | 417 |
| 2170 | 365 |
| 2171 | 92 |
| 2172 | 213 |
| 2173 | 98 |
| 2174 | 121 |
| 2175 | 86 |
| 2176 | 98 |
| 2177 | 550 |
| 2178 | 101 |
| 2179 | 140 |
| 2180 | 217 |
| 2181 | 252 |
| 2182 | 607 |
| 2183 | 281 |
| 2184 | 319 |
| 2185 | 130 |
| 2186 | 117 |
| 2187 | 286 |
| 2188 | 228 |
| 2189 | 338 |
| 2190 | 325 |
| 2191 | 288 |
| 2192 | 229 |
| 2193 | 366 |
| 2194 | 109 |
| 2195 | 150 |
| 2196 | 105 |
| 2197 | 145 |
| 2198 | 497 |
| 2199 | 277 |
| 2200 | 96 |
| 2201 | 333 |
| 2202 | 314 |
| 2203 | 279 |
| 2204 | 218 |
| 2205 | 196 |
| 2206 | 793 |
| 2207 | 202 |
| 2208 | 288 |
| 2209 | 301 |
| 2210 | 833 |
| 2211 | 361 |
| 2212 | 217 |
| 2213 | 290 |
| 2214 | 187 |
| 2215 | 291 |
| 2216 | 874 |
| 2217 | 348 |
| 2218 | 104 |
| 2219 | 150 |
| 2220 | 645 |
| 2221 | 405 |
| 2222 | 323 |
| 2223 | 351 |
| 2224 | 445 |
| 2225 | 536 |
| 2226 | 285 |
| 2227 | 318 |
| 2228 | 189 |
| 2229 | 347 |
| 2230 | 69 |
| 2231 | 263 |
| 2232 | 462 |
| 2233 | 215 |
| 2234 | 332 |
| 2235 | 250 |
| 2236 | 384 |
| 2237 | 103 |
| 2238 | 574 |
| 2239 | 279 |
| 2240 | 421 |
| 2241 | 487 |
| 2242 | 329 |
| 2243 | 105 |
| 2244 | 313 |
| 2245 | 59 |
| 2246 | 193 |
| 2247 | 282 |
| 2248 | 369 |
| 2249 | 112 |
| 2250 | 210 |
| 2251 | 511 |
| 2252 | 497 |
| 2253 | 134 |
| 2254 | 361 |
| 2255 | 301 |
| 2256 | 423 |
| 2257 | 513 |
| 2258 | 194 |
| 2259 | 349 |
| 2260 | 490 |
| 2261 | 743 |
| 2262 | 226 |
| 2263 | 83 |
| 2264 | 248 |
| 2265 | 378 |
| 2266 | 162 |
| 2267 | 192 |
| 2268 | 491 |
| 2269 | 196 |
| 2270 | 337 |
| 2271 | 229 |
| 2272 | 394 |
| 2273 | 64 |
| 2274 | 427 |
| 2275 | 173 |
| 2276 | 148 |
| 2277 | 62 |
| 2278 | 123 |
| 2279 | 491 |
| 2280 | 431 |
| 2281 | 862 |
| 2282 | 423 |
| 2283 | 235 |
| 2284 | 43 |
| 2285 | 130 |
| 2286 | 148 |
| 2287 | 166 |
| 2288 | 279 |
| 2289 | 265 |
| 2290 | 296 |
| 2291 | 279 |
| 2292 | 126 |
| 2293 | 314 |
| 2294 | 128 |
| 2295 | 121 |
| 2296 | 37 |
| 2297 | 72 |
| 2298 | 217 |
| 2299 | 431 |
| 2300 | 146 |
| 2301 | 59 |
| 2302 | 166 |
| 2303 | 118 |
| 2304 | 178 |
| 2305 | 132 |
| 2306 | 61 |
| 2307 | 179 |
| 2308 | 103 |
| 2309 | 122 |
| 2310 | 88 |
| 2311 | 64 |
| 2312 | 144 |
| 2313 | 218 |
| 2314 | 118 |
| 2315 | 92 |
| 2316 | 277 |
| 2317 | 94 |
| 2318 | 207 |
| 2319 | 210 |
| 2320 | 102 |
| 2321 | 341 |
| 2322 | 165 |
| 2323 | 396 |
| 2324 | 695 |
| 2325 | 156 |
| 2326 | 136 |
| 2327 | 244 |
| 2328 | 487 |
| 2329 | 1206 |
| 2330 | 1188 |
| 2331 | 204 |
| 2332 | 121 |
| 2333 | 166 |
| 2334 | 229 |
| 2335 | 141 |
| 2336 | 167 |
| 2337 | 256 |
| 2338 | 299 |
| 2339 | 182 |
| 2340 | 59 |
| 2341 | 50 |
| 2342 | 313 |
| 2343 | 355 |
| 2344 | 174 |
| 2345 | 617 |
| 2346 | 189 |
| 2347 | 326 |
| 2348 | 199 |
| 2349 | 174 |
| 2350 | 233 |
| 2351 | 137 |
| 2352 | 468 |
| 2353 | 176 |
| 2354 | 489 |
| 2355 | 165 |
| 2356 | 235 |
| 2357 | 370 |
| 2358 | 456 |
| 2359 | 179 |
| 2360 | 368 |
| 2361 | 178 |
| 2362 | 427 |
| 2363 | 439 |
| 2364 | 388 |
| 2365 | 229 |
| 2366 | 493 |
| 2367 | 227 |
| 2368 | 366 |
| 2369 | 65 |
| 2370 | 296 |
| 2371 | 253 |
| 2372 | 289 |
| 2373 | 238 |
| 2374 | 338 |
| 2375 | 631 |
| 2376 | 462 |
| 2377 | 255 |
| 2378 | 146 |
| 2379 | 200 |
| 2380 | 284 |
| 2381 | 585 |
| 2382 | 238 |
| 2383 | 556 |
| 2384 | 502 |
| 2385 | 630 |
| 2386 | 255 |
| 2387 | 267 |
| 2388 | 232 |
| 2389 | 264 |
| 2390 | 276 |
| 2391 | 112 |
| 2392 | 44 |
| 2393 | 272 |
| 2394 | 136 |
| 2395 | 241 |
| 2396 | 200 |
| 2397 | 618 |
| 2398 | 288 |
| 2399 | 635 |
| 2400 | 227 |
| 2401 | 262 |
| 2402 | 506 |
| 2403 | 419 |
| 2404 | 275 |
| 2405 | 246 |
| 2406 | 416 |
| 2407 | 93 |
| 2408 | 143 |
| 2409 | 547 |
| 2410 | 82 |
| 2411 | 96 |
| 2412 | 83 |
| 2413 | 167 |
| 2414 | 164 |
| 2415 | 174 |
| 2416 | 164 |
| 2417 | 168 |
| 2418 | 67 |
| 2419 | 64 |
| 2420 | 183 |
| 2421 | 449 |
| 2422 | 299 |
| 2423 | 177 |
| 2424 | 335 |
| 2425 | 156 |
| 2426 | 61 |
| 2427 | 103 |
| 2428 | 205 |
| 2429 | 65 |
| 2430 | 138 |
| 2431 | 230 |
| 2432 | 72 |
| 2433 | 70 |
| 2434 | 394 |
| 2435 | 172 |
| 2436 | 160 |
| 2437 | 157 |
| 2438 | 271 |
| 2439 | 110 |
| 2440 | 344 |
| 2441 | 282 |
| 2442 | 156 |
| 2443 | 242 |